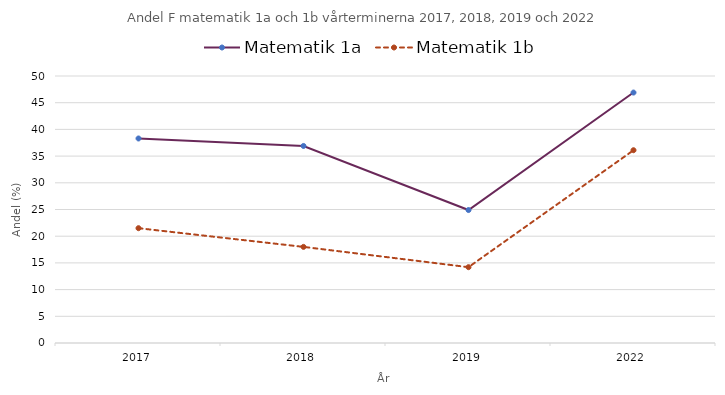
| Category | Matematik 1a | Matematik 1b |
|---|---|---|
| 2017.0 | 38.3 | 21.5 |
| 2018.0 | 36.9 | 18 |
| 2019.0 | 24.9 | 14.2 |
| 2022.0 | 46.9 | 36.1 |